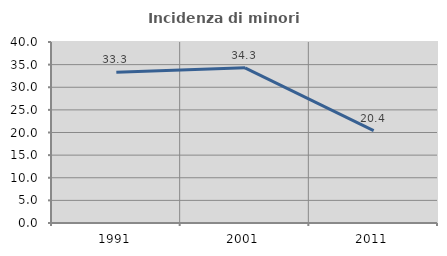
| Category | Incidenza di minori stranieri |
|---|---|
| 1991.0 | 33.333 |
| 2001.0 | 34.286 |
| 2011.0 | 20.408 |